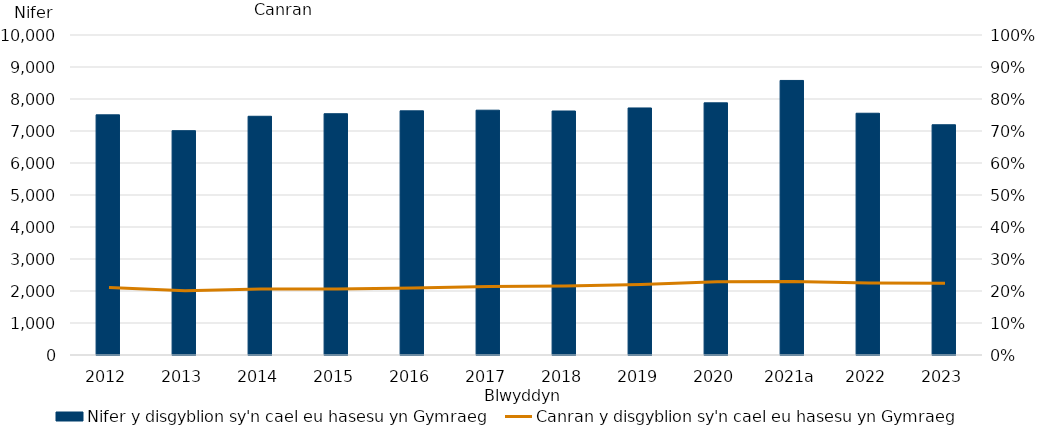
| Category | Nifer y disgyblion sy'n cael eu hasesu yn Gymraeg |
|---|---|
| 2012 | 7505 |
| 2013 | 7010 |
| 2014 | 7460 |
| 2015 | 7540 |
| 2016 | 7630 |
| 2017 | 7650 |
| 2018 | 7625 |
| 2019 | 7720 |
| 2020 | 7880 |
| 2021a | 8580 |
| 2022 | 7555 |
| 2023 | 7195 |